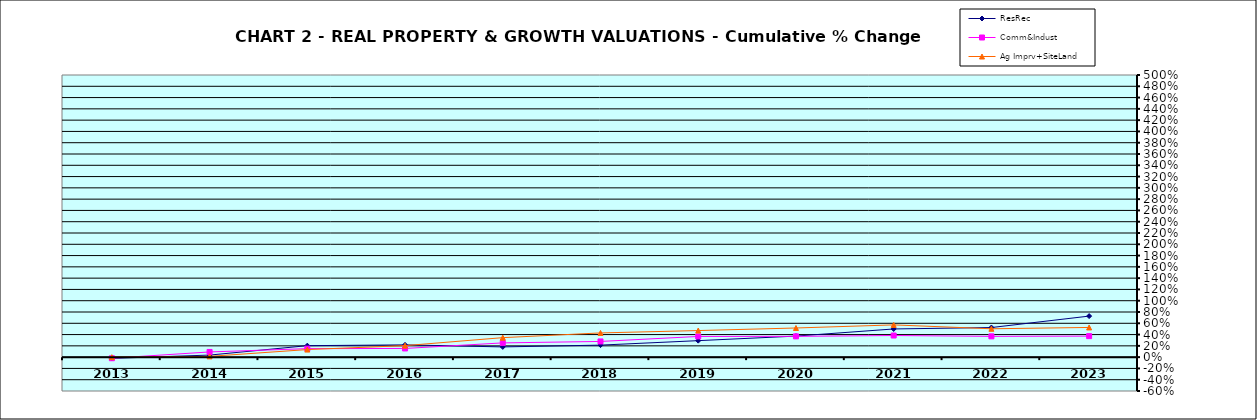
| Category | ResRec | Comm&Indust | Ag Imprv+SiteLand |
|---|---|---|---|
| 2013.0 | -0.021 | -0.019 | 0 |
| 2014.0 | 0.036 | 0.092 | 0.014 |
| 2015.0 | 0.203 | 0.151 | 0.134 |
| 2016.0 | 0.217 | 0.154 | 0.204 |
| 2017.0 | 0.181 | 0.252 | 0.345 |
| 2018.0 | 0.213 | 0.278 | 0.429 |
| 2019.0 | 0.292 | 0.367 | 0.471 |
| 2020.0 | 0.373 | 0.369 | 0.517 |
| 2021.0 | 0.499 | 0.383 | 0.571 |
| 2022.0 | 0.524 | 0.369 | 0.503 |
| 2023.0 | 0.727 | 0.372 | 0.526 |